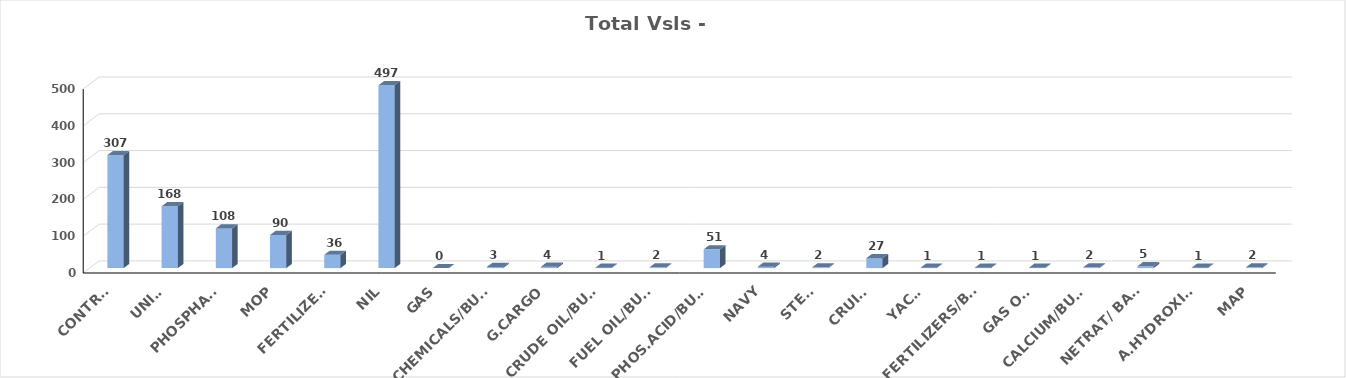
| Category | Series 0 |
|---|---|
| CONTRS. | 307 |
| UNITS | 168 |
| PHOSPHATE | 108 |
| MOP | 90 |
| FERTILIZERS | 36 |
| NIL | 497 |
| GAS | 0 |
| CHEMICALS/BULK | 3 |
| G.CARGO | 4 |
| CRUDE OIL/BULK | 1 |
| FUEL OIL/BULK | 2 |
| PHOS.ACID/BULK | 51 |
| NAVY | 4 |
| STEEL | 2 |
| CRUISE | 27 |
| YACHT | 1 |
| FERTILIZERS/BAGS | 1 |
| GAS OIL | 1 |
| CALCIUM/BULK | 2 |
| NETRAT/ BAGS | 5 |
| A.HYDROXIDE | 1 |
| MAP | 2 |